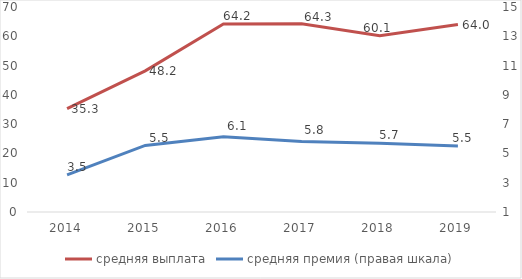
| Category | средняя выплата |
|---|---|
| 2014.0 | 35.308 |
| 2015.0 | 48.201 |
| 2016.0 | 64.17 |
| 2017.0 | 64.278 |
| 2018.0 | 60.148 |
| 2019.0 | 64 |